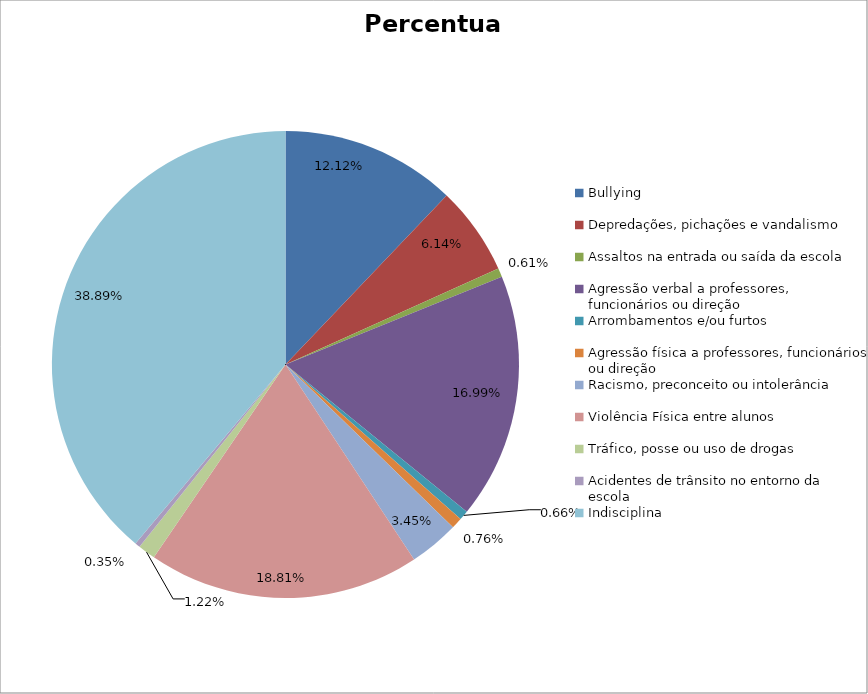
| Category | Percentual |
|---|---|
| Bullying | 0.121 |
| Depredações, pichações e vandalismo | 0.061 |
| Assaltos na entrada ou saída da escola | 0.006 |
| Agressão verbal a professores, funcionários ou direção | 0.17 |
| Arrombamentos e/ou furtos | 0.007 |
| Agressão física a professores, funcionários ou direção | 0.008 |
| Racismo, preconceito ou intolerância | 0.034 |
| Violência Física entre alunos | 0.188 |
| Tráfico, posse ou uso de drogas | 0.012 |
| Acidentes de trânsito no entorno da escola | 0.004 |
| Indisciplina | 0.389 |